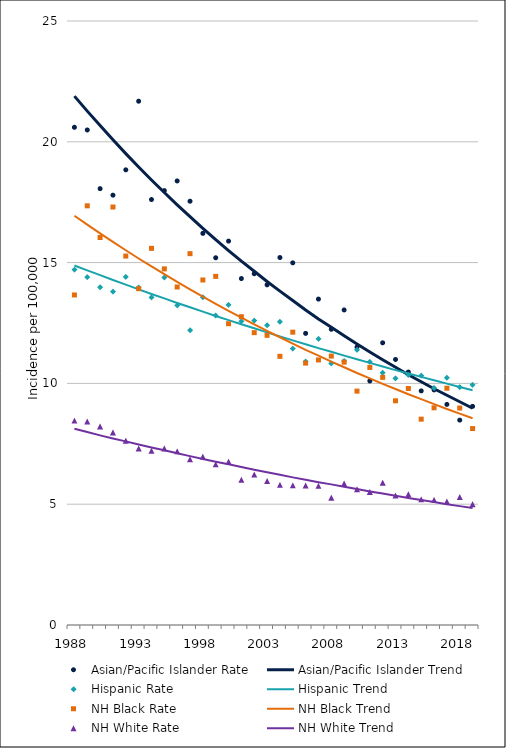
| Category | Asian/Pacific Islander Rate | Asian/Pacific Islander Trend | Hispanic Rate | Hispanic Trend | NH Black Rate | NH Black Trend | NH White Rate | NH White Trend |
|---|---|---|---|---|---|---|---|---|
| 1988.0 | 20.6 | 21.89 | 14.71 | 14.88 | 13.66 | 16.94 | 8.46 | 8.12 |
| 1989.0 | 20.49 | 21.27 | 14.4 | 14.68 | 17.35 | 16.57 | 8.42 | 7.99 |
| 1990.0 | 18.06 | 20.67 | 13.98 | 14.48 | 16.04 | 16.21 | 8.22 | 7.85 |
| 1991.0 | 17.79 | 20.08 | 13.8 | 14.28 | 17.3 | 15.86 | 7.97 | 7.72 |
| 1992.0 | 18.84 | 19.51 | 14.41 | 14.09 | 15.27 | 15.51 | 7.63 | 7.6 |
| 1993.0 | 21.68 | 18.96 | 13.97 | 13.89 | 13.92 | 15.17 | 7.31 | 7.47 |
| 1994.0 | 17.61 | 18.42 | 13.56 | 13.7 | 15.59 | 14.84 | 7.21 | 7.35 |
| 1995.0 | 17.98 | 17.9 | 14.38 | 13.52 | 14.74 | 14.52 | 7.31 | 7.23 |
| 1996.0 | 18.38 | 17.39 | 13.23 | 13.33 | 13.99 | 14.2 | 7.19 | 7.11 |
| 1997.0 | 17.54 | 16.9 | 12.2 | 13.15 | 15.37 | 13.89 | 6.86 | 6.99 |
| 1998.0 | 16.21 | 16.42 | 13.57 | 12.97 | 14.28 | 13.59 | 6.97 | 6.87 |
| 1999.0 | 15.2 | 15.95 | 12.81 | 12.79 | 14.43 | 13.29 | 6.65 | 6.76 |
| 2000.0 | 15.89 | 15.5 | 13.25 | 12.62 | 12.47 | 13 | 6.76 | 6.65 |
| 2001.0 | 14.34 | 15.06 | 12.57 | 12.45 | 12.76 | 12.72 | 6.01 | 6.54 |
| 2002.0 | 14.54 | 14.64 | 12.6 | 12.28 | 12.1 | 12.44 | 6.23 | 6.43 |
| 2003.0 | 14.08 | 14.22 | 12.41 | 12.11 | 11.99 | 12.17 | 5.96 | 6.32 |
| 2004.0 | 15.21 | 13.82 | 12.55 | 11.94 | 11.12 | 11.91 | 5.8 | 6.22 |
| 2005.0 | 14.99 | 13.43 | 11.44 | 11.78 | 12.12 | 11.65 | 5.78 | 6.11 |
| 2006.0 | 12.07 | 13.04 | 10.91 | 11.62 | 10.84 | 11.39 | 5.77 | 6.01 |
| 2007.0 | 13.49 | 12.67 | 11.84 | 11.46 | 10.97 | 11.15 | 5.76 | 5.91 |
| 2008.0 | 12.24 | 12.32 | 10.83 | 11.31 | 11.13 | 10.9 | 5.27 | 5.82 |
| 2009.0 | 13.04 | 11.97 | 10.93 | 11.15 | 10.88 | 10.67 | 5.86 | 5.72 |
| 2010.0 | 11.5 | 11.63 | 11.39 | 11 | 9.68 | 10.43 | 5.62 | 5.63 |
| 2011.0 | 10.1 | 11.3 | 10.89 | 10.85 | 10.66 | 10.21 | 5.51 | 5.53 |
| 2012.0 | 11.68 | 10.98 | 10.44 | 10.7 | 10.25 | 9.98 | 5.89 | 5.44 |
| 2013.0 | 10.99 | 10.67 | 10.21 | 10.55 | 9.28 | 9.77 | 5.36 | 5.35 |
| 2014.0 | 10.47 | 10.36 | 10.35 | 10.41 | 9.79 | 9.55 | 5.41 | 5.26 |
| 2015.0 | 9.69 | 10.07 | 10.32 | 10.27 | 8.52 | 9.35 | 5.2 | 5.17 |
| 2016.0 | 9.73 | 9.78 | 9.81 | 10.13 | 8.99 | 9.14 | 5.18 | 5.09 |
| 2017.0 | 9.13 | 9.51 | 10.23 | 9.99 | 9.8 | 8.94 | 5.11 | 5 |
| 2018.0 | 8.48 | 9.24 | 9.85 | 9.85 | 8.98 | 8.75 | 5.3 | 4.92 |
| 2019.0 | 9.05 | 8.97 | 9.94 | 9.72 | 8.13 | 8.56 | 5 | 4.84 |